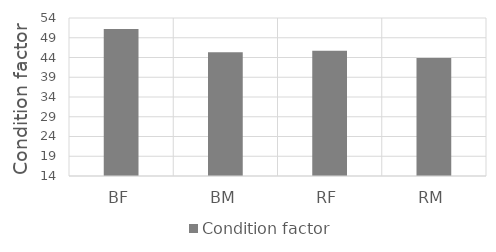
| Category | Condition factor |
|---|---|
| BF | 51.2 |
| BM | 45.3 |
| RF | 45.7 |
| RM | 43.9 |